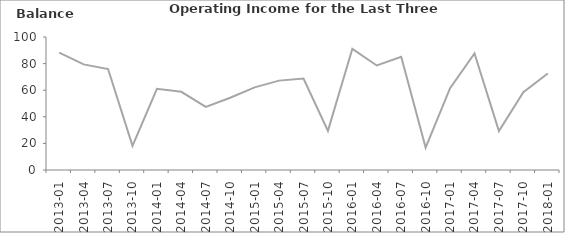
| Category | Balance |
|---|---|
| 2013-01 | 88.2 |
| 2013-04 | 79.4 |
| 2013-07 | 75.9 |
| 2013-10 | 18.2 |
| 2014-01 | 61.1 |
| 2014-04 | 58.8 |
| 2014-07 | 47.4 |
| 2014-10 | 54.3 |
| 2015-01 | 62.1 |
| 2015-04 | 67.2 |
| 2015-07 | 68.8 |
| 2015-10 | 29.4 |
| 2016-01 | 91.1 |
| 2016-04 | 78.6 |
| 2016-07 | 85.2 |
| 2016-10 | 16.9 |
| 2017-01 | 61.5 |
| 2017-04 | 87.6 |
| 2017-07 | 29.3 |
| 2017-10 | 58.5 |
| 2018-01 | 72.6 |